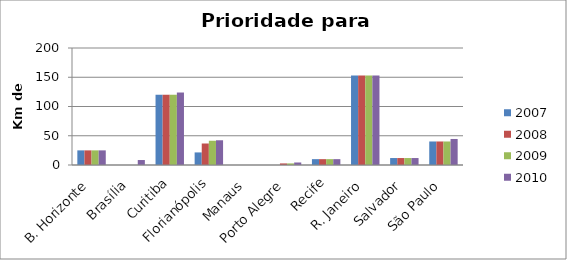
| Category | 2007 | 2008 | 2009 | 2010 |
|---|---|---|---|---|
| B. Horizonte | 25 | 25 | 25 | 25 |
| Brasília | 0 | 0 | 0 | 8.5 |
| Curitiba | 120.1 | 120.1 | 120.1 | 123.902 |
| Florianópolis | 21.5 | 36.75 | 41.45 | 42.28 |
| Manaus | 0 | 0 | 0 | 0 |
| Porto Alegre | 0 | 2.7 | 2.7 | 4.3 |
| Recife | 10 | 10 | 10 | 10 |
| R. Janeiro | 153 | 153 | 153 | 153 |
| Salvador | 11.9 | 11.9 | 11.9 | 11.9 |
| São Paulo | 40.2 | 40.2 | 40.2 | 44.5 |